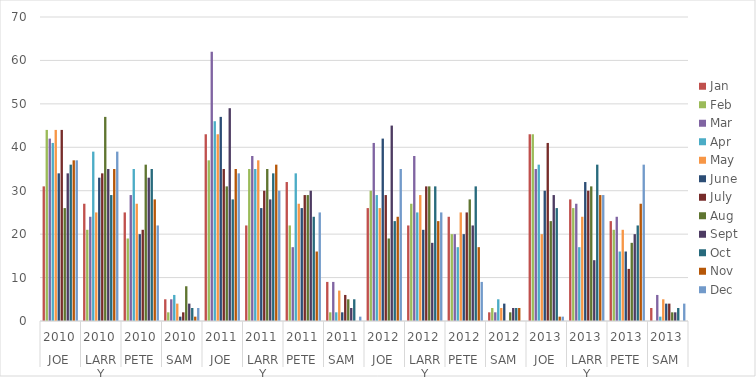
| Category | Jan | Feb | Mar | Apr | May | June | July | Aug | Sept | Oct | Nov | Dec |
|---|---|---|---|---|---|---|---|---|---|---|---|---|
| 0 | 31 | 44 | 42 | 41 | 44 | 34 | 44 | 26 | 34 | 36 | 37 | 37 |
| 1 | 27 | 21 | 24 | 39 | 25 | 33 | 34 | 47 | 35 | 29 | 35 | 39 |
| 2 | 25 | 19 | 29 | 35 | 27 | 20 | 21 | 36 | 33 | 35 | 28 | 22 |
| 3 | 5 | 2 | 5 | 6 | 4 | 1 | 2 | 8 | 4 | 3 | 1 | 3 |
| 4 | 43 | 37 | 62 | 46 | 43 | 47 | 35 | 31 | 49 | 28 | 35 | 34 |
| 5 | 22 | 35 | 38 | 35 | 37 | 26 | 30 | 35 | 28 | 34 | 36 | 30 |
| 6 | 32 | 22 | 17 | 34 | 27 | 26 | 29 | 29 | 30 | 24 | 16 | 25 |
| 7 | 9 | 2 | 9 | 2 | 7 | 2 | 6 | 5 | 3 | 5 | 0 | 1 |
| 8 | 26 | 30 | 41 | 29 | 26 | 42 | 29 | 19 | 45 | 23 | 24 | 35 |
| 9 | 22 | 27 | 38 | 25 | 29 | 21 | 31 | 31 | 18 | 31 | 23 | 25 |
| 10 | 24 | 20 | 20 | 17 | 25 | 20 | 25 | 28 | 22 | 31 | 17 | 9 |
| 11 | 2 | 3 | 2 | 5 | 3 | 4 | 0 | 2 | 3 | 3 | 3 | 0 |
| 12 | 43 | 43 | 35 | 36 | 20 | 30 | 41 | 23 | 29 | 26 | 1 | 1 |
| 13 | 28 | 26 | 27 | 17 | 24 | 32 | 30 | 31 | 14 | 36 | 29 | 29 |
| 14 | 23 | 21 | 24 | 16 | 21 | 16 | 12 | 18 | 20 | 22 | 27 | 36 |
| 15 | 3 | 0 | 6 | 1 | 5 | 4 | 4 | 2 | 2 | 3 | 0 | 4 |